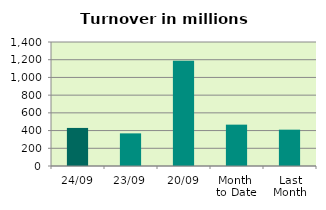
| Category | Series 0 |
|---|---|
| 24/09 | 429.807 |
| 23/09 | 368.336 |
| 20/09 | 1189.053 |
| Month 
to Date | 466.855 |
| Last
Month | 410.207 |